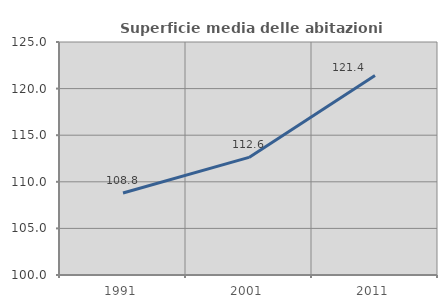
| Category | Superficie media delle abitazioni occupate |
|---|---|
| 1991.0 | 108.798 |
| 2001.0 | 112.616 |
| 2011.0 | 121.402 |